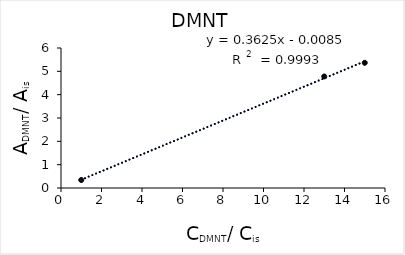
| Category | Series 0 |
|---|---|
| 1.0 | 0.343 |
| 13.0 | 4.78 |
| 15.0 | 5.365 |